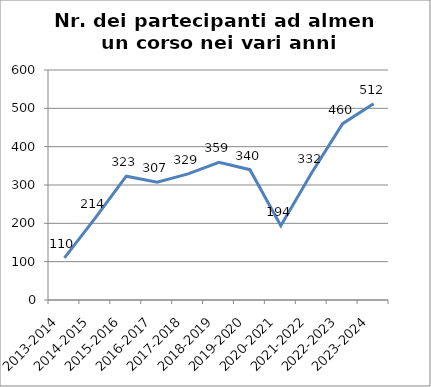
| Category | Nr. Partecipanti ad almeno un Corso |
|---|---|
| 2013-2014 | 110 |
| 2014-2015 | 214 |
| 2015-2016 | 323 |
| 2016-2017 | 307 |
| 2017-2018 | 329 |
| 2018-2019 | 359 |
| 2019-2020 | 340 |
| 2020-2021 | 194 |
| 2021-2022 | 332 |
| 2022-2023 | 460 |
| 2023-2024 | 512 |